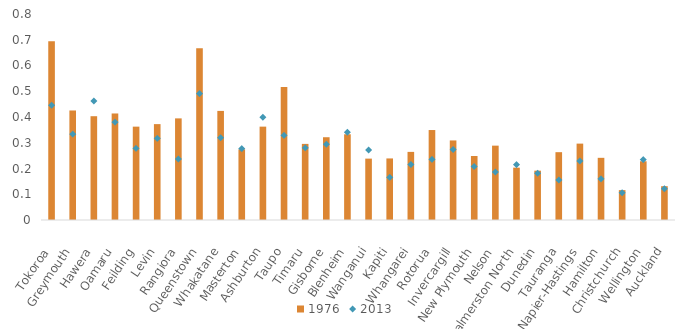
| Category | 1976 |
|---|---|
| Tokoroa | 0.694 |
| Greymouth | 0.425 |
| Hawera | 0.403 |
| Oamaru | 0.414 |
| Feilding | 0.363 |
| Levin | 0.372 |
| Rangiora | 0.395 |
| Queenstown | 0.667 |
| Whakatane | 0.424 |
| Masterton | 0.274 |
| Ashburton | 0.363 |
| Taupo | 0.517 |
| Timaru | 0.296 |
| Gisborne | 0.321 |
| Blenheim | 0.333 |
| Wanganui | 0.238 |
| Kapiti | 0.239 |
| Whangarei | 0.265 |
| Rotorua | 0.349 |
| Invercargill | 0.309 |
| New Plymouth | 0.249 |
| Nelson | 0.289 |
| Palmerston North | 0.203 |
| Dunedin | 0.192 |
| Tauranga | 0.263 |
| Napier-Hastings | 0.297 |
| Hamilton | 0.241 |
| Christchurch | 0.116 |
| Wellington | 0.228 |
| Auckland | 0.131 |